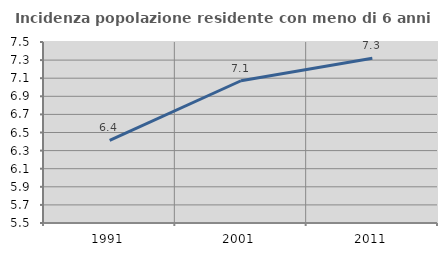
| Category | Incidenza popolazione residente con meno di 6 anni |
|---|---|
| 1991.0 | 6.413 |
| 2001.0 | 7.072 |
| 2011.0 | 7.322 |